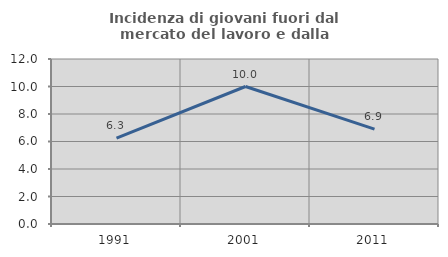
| Category | Incidenza di giovani fuori dal mercato del lavoro e dalla formazione  |
|---|---|
| 1991.0 | 6.25 |
| 2001.0 | 10 |
| 2011.0 | 6.897 |